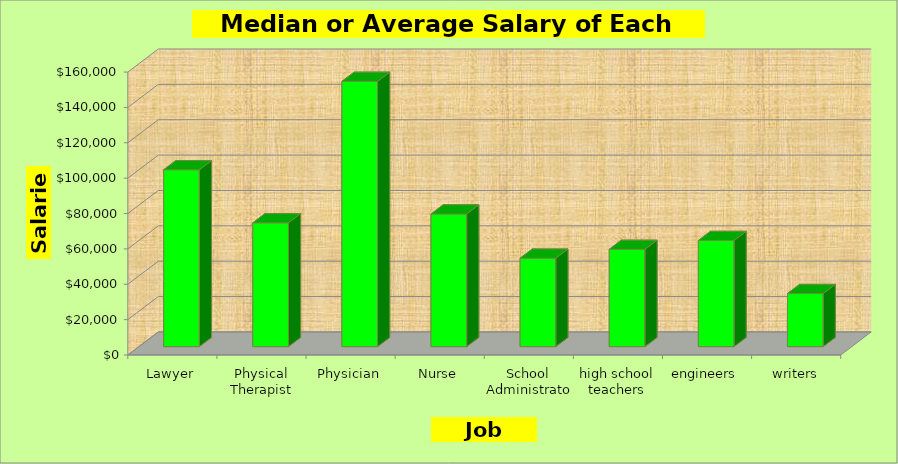
| Category | Median or Average Annual Salary for each Career Average Annual Salary |
|---|---|
| Lawyer | 100000 |
| Physical Therapist | 70000 |
| Physician | 150000 |
| Nurse | 75000 |
| School Administrator | 50000 |
| high school teachers | 55000 |
| engineers | 60000 |
| writers | 30000 |